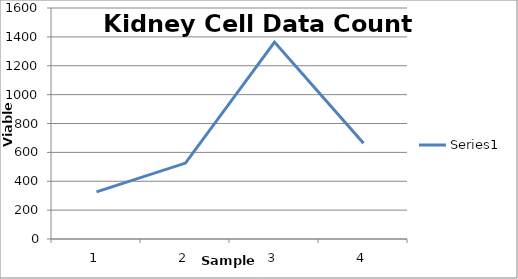
| Category | Series 0 |
|---|---|
| 0 | 326 |
| 1 | 526 |
| 2 | 1364 |
| 3 | 664 |